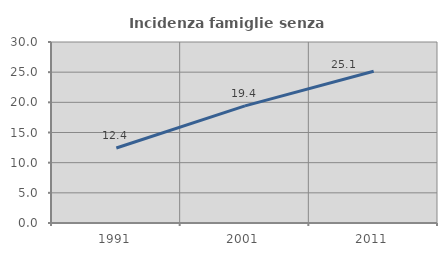
| Category | Incidenza famiglie senza nuclei |
|---|---|
| 1991.0 | 12.429 |
| 2001.0 | 19.408 |
| 2011.0 | 25.147 |